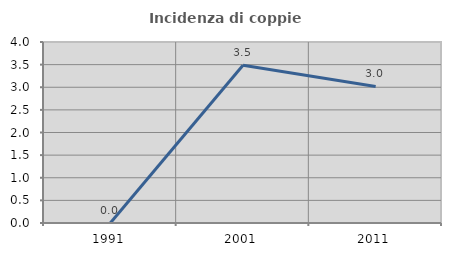
| Category | Incidenza di coppie miste |
|---|---|
| 1991.0 | 0 |
| 2001.0 | 3.484 |
| 2011.0 | 3.019 |